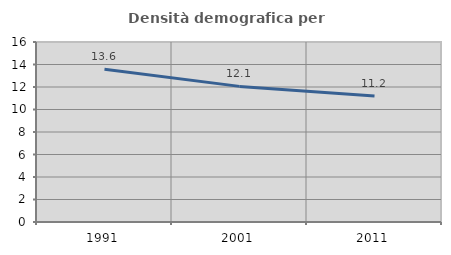
| Category | Densità demografica |
|---|---|
| 1991.0 | 13.582 |
| 2001.0 | 12.055 |
| 2011.0 | 11.198 |